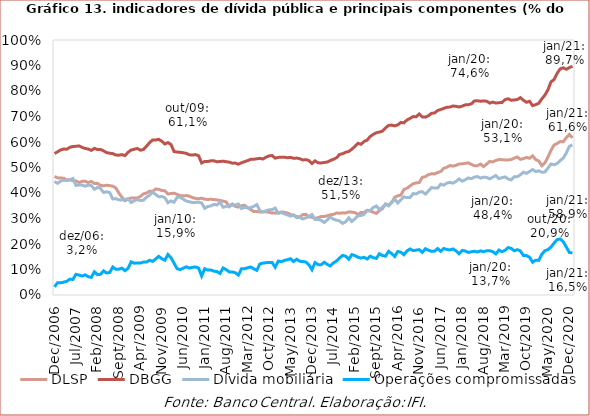
| Category | DLSP | DBGG | Dívida mobiliária | Operações compromissadas |
|---|---|---|---|---|
| 2006-12-01 | 0.465 | 0.555 | 0.446 | 0.032 |
| 2007-01-01 | 0.459 | 0.562 | 0.438 | 0.048 |
| 2007-02-01 | 0.459 | 0.569 | 0.446 | 0.048 |
| 2007-03-01 | 0.458 | 0.572 | 0.451 | 0.05 |
| 2007-04-01 | 0.451 | 0.572 | 0.448 | 0.054 |
| 2007-05-01 | 0.452 | 0.579 | 0.452 | 0.062 |
| 2007-06-01 | 0.448 | 0.582 | 0.457 | 0.061 |
| 2007-07-01 | 0.447 | 0.583 | 0.43 | 0.081 |
| 2007-08-01 | 0.441 | 0.585 | 0.432 | 0.078 |
| 2007-09-01 | 0.446 | 0.579 | 0.431 | 0.074 |
| 2007-10-01 | 0.446 | 0.575 | 0.427 | 0.079 |
| 2007-11-01 | 0.441 | 0.572 | 0.431 | 0.072 |
| 2007-12-01 | 0.445 | 0.567 | 0.429 | 0.069 |
| 2008-01-01 | 0.437 | 0.575 | 0.415 | 0.091 |
| 2008-02-01 | 0.438 | 0.57 | 0.422 | 0.08 |
| 2008-03-01 | 0.43 | 0.571 | 0.418 | 0.081 |
| 2008-04-01 | 0.428 | 0.565 | 0.402 | 0.095 |
| 2008-05-01 | 0.43 | 0.558 | 0.405 | 0.086 |
| 2008-06-01 | 0.429 | 0.556 | 0.402 | 0.088 |
| 2008-07-01 | 0.427 | 0.555 | 0.377 | 0.11 |
| 2008-08-01 | 0.42 | 0.549 | 0.378 | 0.101 |
| 2008-09-01 | 0.4 | 0.548 | 0.373 | 0.101 |
| 2008-10-01 | 0.383 | 0.551 | 0.373 | 0.105 |
| 2008-11-01 | 0.37 | 0.547 | 0.375 | 0.095 |
| 2008-12-01 | 0.376 | 0.56 | 0.378 | 0.105 |
| 2009-01-01 | 0.38 | 0.569 | 0.363 | 0.13 |
| 2009-02-01 | 0.38 | 0.572 | 0.37 | 0.125 |
| 2009-03-01 | 0.38 | 0.575 | 0.374 | 0.126 |
| 2009-04-01 | 0.386 | 0.568 | 0.37 | 0.125 |
| 2009-05-01 | 0.397 | 0.571 | 0.371 | 0.129 |
| 2009-06-01 | 0.4 | 0.583 | 0.383 | 0.129 |
| 2009-07-01 | 0.407 | 0.597 | 0.391 | 0.136 |
| 2009-08-01 | 0.407 | 0.608 | 0.403 | 0.132 |
| 2009-09-01 | 0.416 | 0.608 | 0.394 | 0.141 |
| 2009-10-01 | 0.415 | 0.611 | 0.385 | 0.152 |
| 2009-11-01 | 0.41 | 0.603 | 0.386 | 0.143 |
| 2009-12-01 | 0.409 | 0.592 | 0.382 | 0.136 |
| 2010-01-01 | 0.396 | 0.598 | 0.362 | 0.159 |
| 2010-02-01 | 0.398 | 0.59 | 0.369 | 0.146 |
| 2010-03-01 | 0.399 | 0.562 | 0.364 | 0.125 |
| 2010-04-01 | 0.395 | 0.561 | 0.383 | 0.103 |
| 2010-05-01 | 0.39 | 0.56 | 0.384 | 0.1 |
| 2010-06-01 | 0.389 | 0.558 | 0.376 | 0.105 |
| 2010-07-01 | 0.39 | 0.555 | 0.368 | 0.111 |
| 2010-08-01 | 0.388 | 0.55 | 0.366 | 0.106 |
| 2010-09-01 | 0.382 | 0.549 | 0.363 | 0.108 |
| 2010-10-01 | 0.379 | 0.551 | 0.363 | 0.11 |
| 2010-11-01 | 0.377 | 0.546 | 0.364 | 0.106 |
| 2010-12-01 | 0.38 | 0.518 | 0.361 | 0.074 |
| 2011-01-01 | 0.376 | 0.524 | 0.34 | 0.103 |
| 2011-02-01 | 0.375 | 0.524 | 0.347 | 0.098 |
| 2011-03-01 | 0.375 | 0.526 | 0.35 | 0.098 |
| 2011-04-01 | 0.374 | 0.526 | 0.355 | 0.093 |
| 2011-05-01 | 0.373 | 0.523 | 0.353 | 0.092 |
| 2011-06-01 | 0.371 | 0.524 | 0.364 | 0.084 |
| 2011-07-01 | 0.368 | 0.525 | 0.344 | 0.106 |
| 2011-08-01 | 0.365 | 0.523 | 0.347 | 0.1 |
| 2011-09-01 | 0.347 | 0.521 | 0.353 | 0.09 |
| 2011-10-01 | 0.356 | 0.517 | 0.352 | 0.09 |
| 2011-11-01 | 0.348 | 0.517 | 0.353 | 0.087 |
| 2011-12-01 | 0.345 | 0.513 | 0.357 | 0.078 |
| 2012-01-01 | 0.35 | 0.519 | 0.339 | 0.103 |
| 2012-02-01 | 0.352 | 0.523 | 0.343 | 0.103 |
| 2012-03-01 | 0.343 | 0.527 | 0.342 | 0.107 |
| 2012-04-01 | 0.335 | 0.532 | 0.342 | 0.11 |
| 2012-05-01 | 0.327 | 0.532 | 0.347 | 0.103 |
| 2012-06-01 | 0.328 | 0.534 | 0.355 | 0.097 |
| 2012-07-01 | 0.325 | 0.536 | 0.331 | 0.122 |
| 2012-08-01 | 0.326 | 0.533 | 0.325 | 0.125 |
| 2012-09-01 | 0.326 | 0.54 | 0.33 | 0.127 |
| 2012-10-01 | 0.325 | 0.546 | 0.334 | 0.128 |
| 2012-11-01 | 0.321 | 0.547 | 0.335 | 0.127 |
| 2012-12-01 | 0.322 | 0.537 | 0.341 | 0.109 |
| 2013-01-01 | 0.322 | 0.54 | 0.321 | 0.133 |
| 2013-02-01 | 0.326 | 0.54 | 0.323 | 0.13 |
| 2013-03-01 | 0.324 | 0.541 | 0.318 | 0.136 |
| 2013-04-01 | 0.322 | 0.538 | 0.314 | 0.138 |
| 2013-05-01 | 0.315 | 0.54 | 0.309 | 0.142 |
| 2013-06-01 | 0.312 | 0.536 | 0.314 | 0.131 |
| 2013-07-01 | 0.308 | 0.537 | 0.303 | 0.14 |
| 2013-08-01 | 0.306 | 0.534 | 0.304 | 0.133 |
| 2013-09-01 | 0.315 | 0.529 | 0.298 | 0.131 |
| 2013-10-01 | 0.316 | 0.531 | 0.303 | 0.129 |
| 2013-11-01 | 0.306 | 0.527 | 0.308 | 0.118 |
| 2013-12-01 | 0.305 | 0.515 | 0.315 | 0.099 |
| 2014-01-01 | 0.3 | 0.526 | 0.296 | 0.127 |
| 2014-02-01 | 0.304 | 0.518 | 0.296 | 0.119 |
| 2014-03-01 | 0.308 | 0.518 | 0.293 | 0.119 |
| 2014-04-01 | 0.308 | 0.52 | 0.284 | 0.128 |
| 2014-05-01 | 0.311 | 0.521 | 0.294 | 0.12 |
| 2014-06-01 | 0.315 | 0.527 | 0.305 | 0.114 |
| 2014-07-01 | 0.316 | 0.532 | 0.298 | 0.126 |
| 2014-08-01 | 0.321 | 0.538 | 0.294 | 0.133 |
| 2014-09-01 | 0.321 | 0.551 | 0.29 | 0.145 |
| 2014-10-01 | 0.322 | 0.554 | 0.281 | 0.155 |
| 2014-11-01 | 0.322 | 0.56 | 0.287 | 0.152 |
| 2014-12-01 | 0.326 | 0.563 | 0.303 | 0.14 |
| 2015-01-01 | 0.325 | 0.572 | 0.289 | 0.158 |
| 2015-02-01 | 0.323 | 0.583 | 0.299 | 0.155 |
| 2015-03-01 | 0.316 | 0.595 | 0.311 | 0.148 |
| 2015-04-01 | 0.323 | 0.591 | 0.311 | 0.145 |
| 2015-05-01 | 0.324 | 0.602 | 0.316 | 0.148 |
| 2015-06-01 | 0.332 | 0.607 | 0.33 | 0.141 |
| 2015-07-01 | 0.329 | 0.622 | 0.332 | 0.152 |
| 2015-08-01 | 0.325 | 0.63 | 0.343 | 0.146 |
| 2015-09-01 | 0.32 | 0.636 | 0.349 | 0.144 |
| 2015-10-01 | 0.33 | 0.639 | 0.336 | 0.162 |
| 2015-11-01 | 0.339 | 0.643 | 0.343 | 0.155 |
| 2015-12-01 | 0.356 | 0.655 | 0.357 | 0.152 |
| 2016-01-01 | 0.353 | 0.665 | 0.349 | 0.171 |
| 2016-02-01 | 0.363 | 0.666 | 0.362 | 0.162 |
| 2016-03-01 | 0.383 | 0.663 | 0.376 | 0.151 |
| 2016-04-01 | 0.389 | 0.667 | 0.361 | 0.171 |
| 2016-05-01 | 0.391 | 0.677 | 0.373 | 0.168 |
| 2016-06-01 | 0.413 | 0.675 | 0.385 | 0.158 |
| 2016-07-01 | 0.419 | 0.686 | 0.382 | 0.173 |
| 2016-08-01 | 0.427 | 0.692 | 0.382 | 0.18 |
| 2016-09-01 | 0.436 | 0.7 | 0.398 | 0.174 |
| 2016-10-01 | 0.44 | 0.699 | 0.396 | 0.176 |
| 2016-11-01 | 0.441 | 0.71 | 0.404 | 0.178 |
| 2016-12-01 | 0.461 | 0.698 | 0.405 | 0.167 |
| 2017-01-01 | 0.464 | 0.697 | 0.396 | 0.181 |
| 2017-02-01 | 0.472 | 0.703 | 0.408 | 0.176 |
| 2017-03-01 | 0.475 | 0.712 | 0.421 | 0.171 |
| 2017-04-01 | 0.475 | 0.714 | 0.419 | 0.172 |
| 2017-05-01 | 0.48 | 0.723 | 0.419 | 0.182 |
| 2017-06-01 | 0.484 | 0.727 | 0.435 | 0.171 |
| 2017-07-01 | 0.497 | 0.732 | 0.431 | 0.183 |
| 2017-08-01 | 0.501 | 0.736 | 0.439 | 0.179 |
| 2017-09-01 | 0.508 | 0.737 | 0.442 | 0.177 |
| 2017-10-01 | 0.505 | 0.741 | 0.439 | 0.181 |
| 2017-11-01 | 0.508 | 0.74 | 0.445 | 0.173 |
| 2017-12-01 | 0.514 | 0.737 | 0.455 | 0.162 |
| 2018-01-01 | 0.514 | 0.741 | 0.446 | 0.175 |
| 2018-02-01 | 0.516 | 0.746 | 0.452 | 0.173 |
| 2018-03-01 | 0.518 | 0.746 | 0.459 | 0.167 |
| 2018-04-01 | 0.512 | 0.75 | 0.456 | 0.169 |
| 2018-05-01 | 0.507 | 0.761 | 0.463 | 0.172 |
| 2018-06-01 | 0.507 | 0.762 | 0.464 | 0.169 |
| 2018-07-01 | 0.513 | 0.76 | 0.458 | 0.173 |
| 2018-08-01 | 0.504 | 0.761 | 0.462 | 0.17 |
| 2018-09-01 | 0.513 | 0.76 | 0.461 | 0.174 |
| 2018-10-01 | 0.524 | 0.753 | 0.455 | 0.174 |
| 2018-11-01 | 0.522 | 0.756 | 0.462 | 0.17 |
| 2018-12-01 | 0.528 | 0.753 | 0.469 | 0.161 |
| 2019-01-01 | 0.531 | 0.754 | 0.456 | 0.176 |
| 2019-02-01 | 0.531 | 0.755 | 0.46 | 0.17 |
| 2019-03-01 | 0.53 | 0.766 | 0.463 | 0.175 |
| 2019-04-01 | 0.53 | 0.77 | 0.455 | 0.186 |
| 2019-05-01 | 0.531 | 0.764 | 0.452 | 0.183 |
| 2019-06-01 | 0.537 | 0.765 | 0.464 | 0.173 |
| 2019-07-01 | 0.541 | 0.766 | 0.464 | 0.178 |
| 2019-08-01 | 0.532 | 0.774 | 0.471 | 0.173 |
| 2019-09-01 | 0.535 | 0.764 | 0.482 | 0.155 |
| 2019-10-01 | 0.54 | 0.756 | 0.477 | 0.155 |
| 2019-11-01 | 0.536 | 0.76 | 0.484 | 0.148 |
| 2019-12-01 | 0.546 | 0.743 | 0.492 | 0.128 |
| 2020-01-01 | 0.531 | 0.746 | 0.484 | 0.137 |
| 2020-02-01 | 0.526 | 0.752 | 0.487 | 0.136 |
| 2020-03-01 | 0.507 | 0.769 | 0.481 | 0.16 |
| 2020-04-01 | 0.518 | 0.784 | 0.482 | 0.174 |
| 2020-05-01 | 0.541 | 0.805 | 0.498 | 0.178 |
| 2020-06-01 | 0.567 | 0.836 | 0.514 | 0.188 |
| 2020-07-01 | 0.588 | 0.845 | 0.51 | 0.204 |
| 2020-08-01 | 0.594 | 0.869 | 0.516 | 0.217 |
| 2020-09-01 | 0.602 | 0.887 | 0.527 | 0.22 |
| 2020-10-01 | 0.601 | 0.891 | 0.537 | 0.209 |
| 2020-11-01 | 0.617 | 0.885 | 0.557 | 0.188 |
| 2020-12-01 | 0.63 | 0.892 | 0.583 | 0.167 |
| 2021-01-01 | 0.616 | 0.897 | 0.589 | 0.165 |